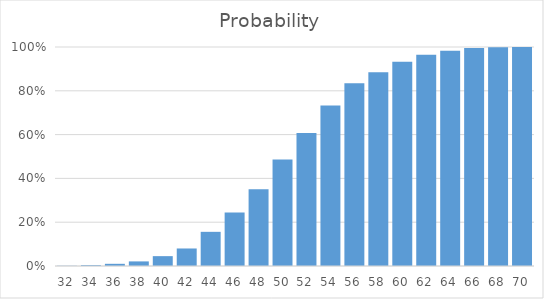
| Category | Probability |
|---|---|
| 32.0 | 0.001 |
| 34.0 | 0.004 |
| 36.0 | 0.01 |
| 38.0 | 0.021 |
| 40.0 | 0.045 |
| 42.0 | 0.08 |
| 44.0 | 0.156 |
| 46.0 | 0.244 |
| 48.0 | 0.35 |
| 50.0 | 0.486 |
| 52.0 | 0.607 |
| 54.0 | 0.733 |
| 56.0 | 0.834 |
| 58.0 | 0.885 |
| 60.0 | 0.933 |
| 62.0 | 0.965 |
| 64.0 | 0.983 |
| 66.0 | 0.995 |
| 68.0 | 0.999 |
| 70.0 | 1 |